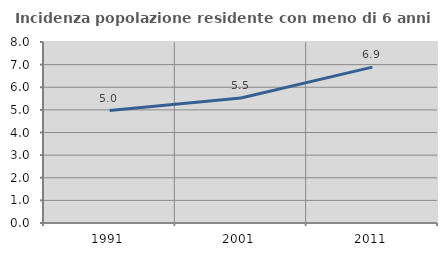
| Category | Incidenza popolazione residente con meno di 6 anni |
|---|---|
| 1991.0 | 4.971 |
| 2001.0 | 5.527 |
| 2011.0 | 6.889 |